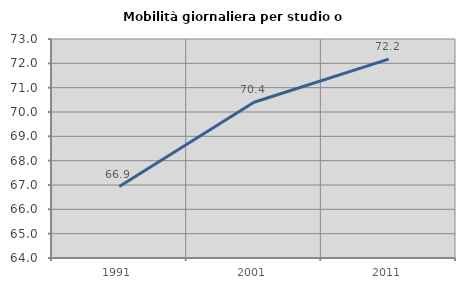
| Category | Mobilità giornaliera per studio o lavoro |
|---|---|
| 1991.0 | 66.937 |
| 2001.0 | 70.401 |
| 2011.0 | 72.175 |